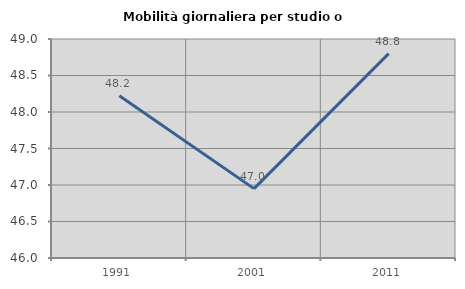
| Category | Mobilità giornaliera per studio o lavoro |
|---|---|
| 1991.0 | 48.223 |
| 2001.0 | 46.95 |
| 2011.0 | 48.799 |